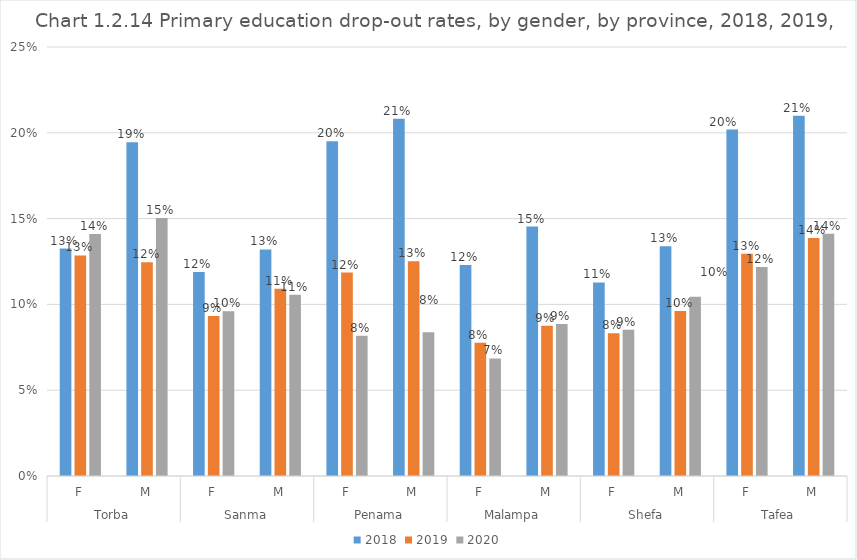
| Category | 2018 | 2019 | 2020 |
|---|---|---|---|
| 0 | 0.133 | 0.129 | 0.141 |
| 1 | 0.194 | 0.125 | 0.15 |
| 2 | 0.119 | 0.093 | 0.096 |
| 3 | 0.132 | 0.109 | 0.106 |
| 4 | 0.195 | 0.119 | 0.082 |
| 5 | 0.208 | 0.125 | 0.084 |
| 6 | 0.123 | 0.078 | 0.069 |
| 7 | 0.145 | 0.088 | 0.089 |
| 8 | 0.113 | 0.083 | 0.085 |
| 9 | 0.134 | 0.096 | 0.104 |
| 10 | 0.202 | 0.13 | 0.122 |
| 11 | 0.21 | 0.139 | 0.141 |